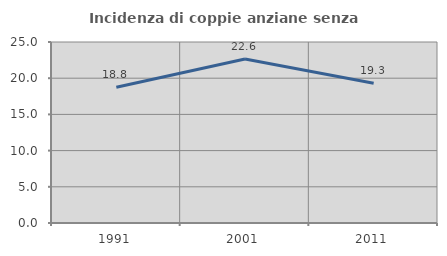
| Category | Incidenza di coppie anziane senza figli  |
|---|---|
| 1991.0 | 18.75 |
| 2001.0 | 22.642 |
| 2011.0 | 19.298 |